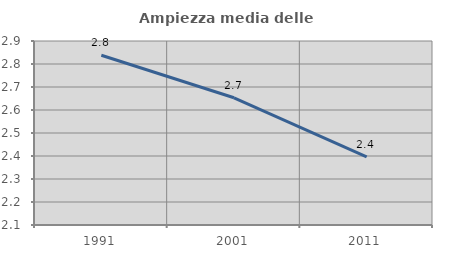
| Category | Ampiezza media delle famiglie |
|---|---|
| 1991.0 | 2.838 |
| 2001.0 | 2.653 |
| 2011.0 | 2.396 |